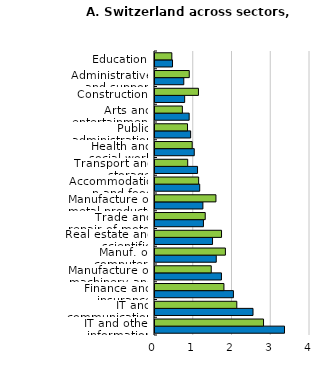
| Category | Average last 4 quarters | Average last 8 years |
|---|---|---|
| IT and other information services¹ | 3.342 | 2.801 |
| IT and communications | 2.529 | 2.111 |
| Finance and insurance | 2.024 | 1.779 |
| Manufacture of machinery and equipment n.e.c. | 1.715 | 1.452 |
| Manuf. of computer, electr. & optical prod.; watches and clocks | 1.581 | 1.817 |
| Real estate and scientific service activities | 1.485 | 1.717 |
| Trade and repair of motor vehicles and motorcycles | 1.25 | 1.296 |
| Manufacture of metal products | 1.236 | 1.573 |
| Accommodation and food services | 1.154 | 1.127 |
| Transport and storage | 1.098 | 0.844 |
| Health and social work activities | 1.013 | 0.96 |
| Public administration | 0.92 | 0.839 |
| Arts and entertainment | 0.882 | 0.706 |
| Construction | 0.766 | 1.121 |
| Administrative and support service activities | 0.743 | 0.884 |
| Education | 0.452 | 0.434 |